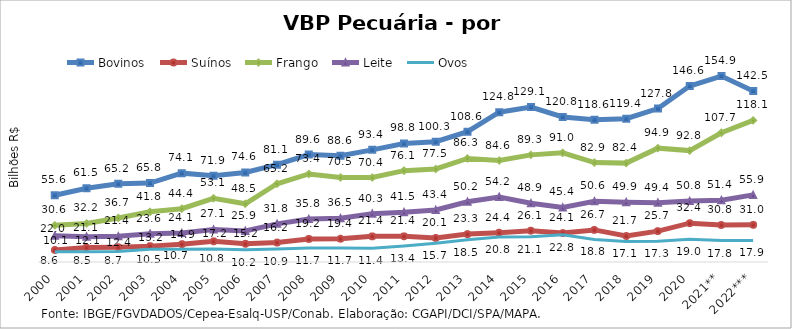
| Category | Bovinos | Suínos | Frango | Leite | Ovos |
|---|---|---|---|---|---|
| 2000 | 55.592 | 10.066 | 30.59 | 21.958 | 8.586 |
| 2001 | 61.452 | 12.076 | 32.152 | 21.13 | 8.46 |
| 2002 | 65.212 | 12.377 | 36.701 | 21.396 | 8.717 |
| 2003 | 65.816 | 13.228 | 41.842 | 23.561 | 10.544 |
| 2004 | 74.051 | 14.872 | 44.43 | 24.081 | 10.686 |
| 2005 | 71.893 | 17.243 | 53.119 | 27.084 | 10.759 |
| 2006 | 74.642 | 15.168 | 48.527 | 25.87 | 10.22 |
| 2007 | 81.119 | 16.219 | 65.201 | 31.803 | 10.861 |
| 2008 | 89.565 | 19.205 | 73.395 | 35.777 | 11.73 |
| 2009 | 88.631 | 19.413 | 70.47 | 36.475 | 11.696 |
| 2010 | 93.443 | 21.357 | 70.384 | 40.282 | 11.376 |
| 2011 | 98.784 | 21.39 | 76.124 | 41.526 | 13.404 |
| 2012 | 100.257 | 20.084 | 77.545 | 43.393 | 15.713 |
| 2013 | 108.643 | 23.254 | 86.308 | 50.214 | 18.481 |
| 2014 | 124.811 | 24.425 | 84.563 | 54.224 | 20.764 |
| 2015 | 129.106 | 26.102 | 89.272 | 48.947 | 21.141 |
| 2016 | 120.849 | 24.089 | 90.962 | 45.417 | 22.792 |
| 2017 | 118.593 | 26.741 | 82.851 | 50.604 | 18.787 |
| 2018 | 119.388 | 21.656 | 82.399 | 49.852 | 17.083 |
| 2019 | 127.838 | 25.741 | 94.874 | 49.39 | 17.301 |
| 2020 | 146.638 | 32.356 | 92.822 | 50.779 | 19 |
| 2021** | 154.932 | 30.824 | 107.715 | 51.434 | 17.815 |
| 2022*** | 142.521 | 30.967 | 118.084 | 55.935 | 17.934 |